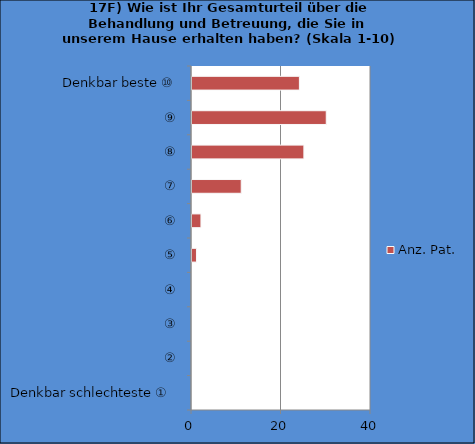
| Category | Anz. Pat. |
|---|---|
| Denkbar schlechteste ①  | 0 |
| ② | 0 |
| ③ | 0 |
| ④ | 0 |
| ⑤ | 1 |
| ⑥ | 2 |
| ⑦ | 11 |
| ⑧ | 25 |
| ⑨ | 30 |
| Denkbar beste ⑩ | 24 |